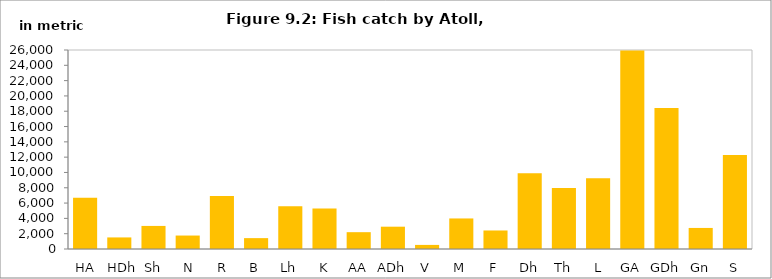
| Category | Series 0 |
|---|---|
|  HA | 6703.54 |
|  HDh | 1512.267 |
|  Sh | 3014.448 |
|  N | 1758.631 |
|  R | 6926.799 |
| B | 1421.065 |
| Lh | 5585.828 |
| K | 5301.439 |
| AA | 2197.478 |
| ADh | 2915.005 |
| V | 534.618 |
| M | 3990.975 |
| F | 2419.64 |
| Dh | 9890.061 |
| Th | 7964.345 |
|  L | 9244.294 |
| GA | 25924.721 |
| GDh | 18428.99 |
| Gn | 2751.764 |
| S | 12268.504 |